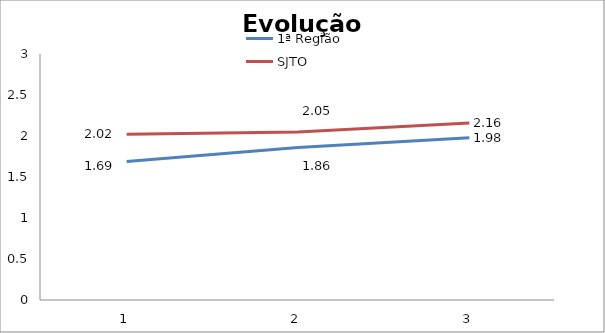
| Category | 1ª Região | SJTO |
|---|---|---|
| 0 | 1.69 | 2.02 |
| 1 | 1.86 | 2.05 |
| 2 | 1.98 | 2.16 |